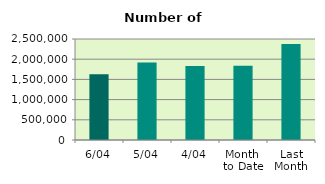
| Category | Series 0 |
|---|---|
| 6/04 | 1627374 |
| 5/04 | 1920258 |
| 4/04 | 1833380 |
| Month 
to Date | 1839213 |
| Last
Month | 2375448 |